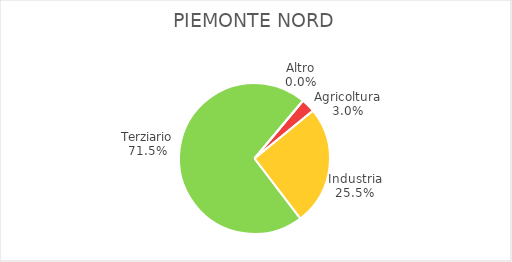
| Category | Piemonte Nord |
|---|---|
| Agricoltura | 1846 |
| Industria | 15873 |
| Terziario | 44408 |
| Altro | 15 |